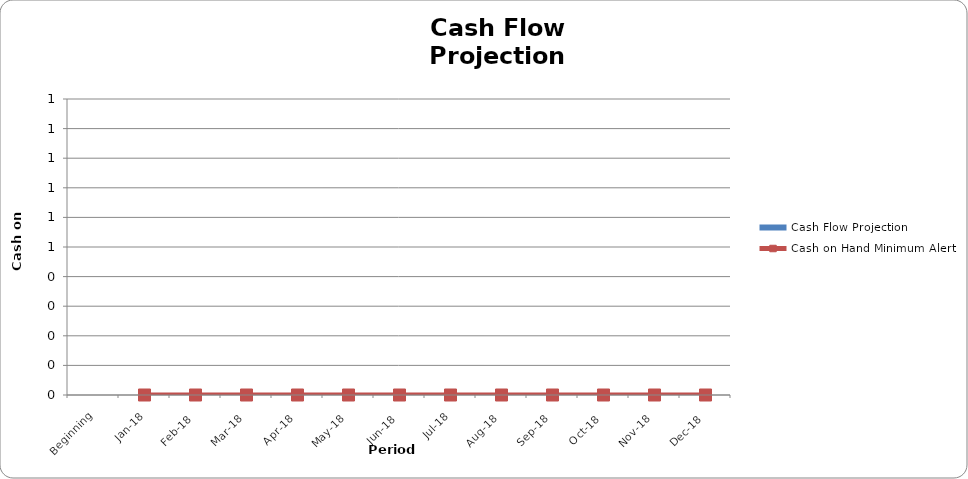
| Category | Cash Flow Projection |
|---|---|
| Beginning | 0 |
| Jan-18 | 0 |
| Feb-18 | 0 |
| Mar-18 | 0 |
| Apr-18 | 0 |
| May-18 | 0 |
| Jun-18 | 0 |
| Jul-18 | 0 |
| Aug-18 | 0 |
| Sep-18 | 0 |
| Oct-18 | 0 |
| Nov-18 | 0 |
| Dec-18 | 0 |